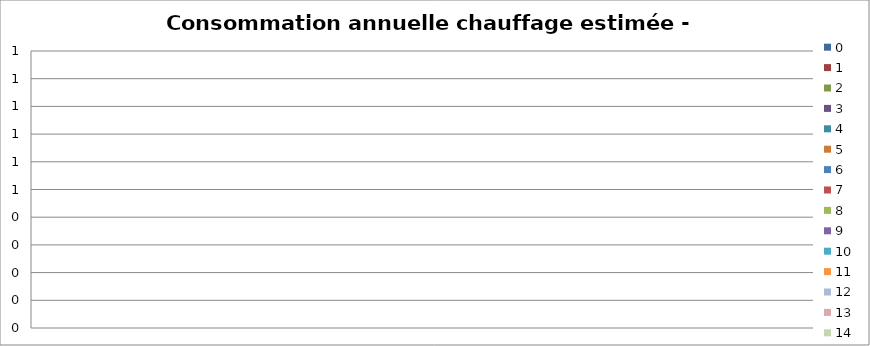
| Category | 0 | 1 | 2 | 3 | 4 | 5 | 6 | 7 | 8 | 9 | 10 | 11 | 12 | 13 | 14 |
|---|---|---|---|---|---|---|---|---|---|---|---|---|---|---|---|
| TOTAL - kWh | 0 | 0 | 0 | 0 | 0 | 0 | 0 | 0 | 0 | 0 | 0 | 0 | 0 | 0 | 0 |